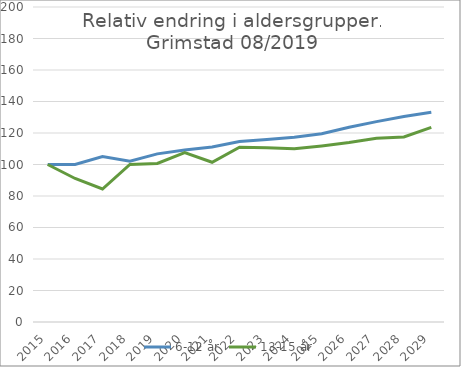
| Category | 6-12 år | 13-15 år |
|---|---|---|
| 2015.0 | 100 | 100 |
| 2016.0 | 100 | 91.111 |
| 2017.0 | 105.051 | 84.444 |
| 2018.0 | 102.02 | 100 |
| 2019.0 | 106.753 | 100.701 |
| 2020.0 | 109.23 | 107.504 |
| 2021.0 | 111.169 | 101.424 |
| 2022.0 | 114.6 | 110.996 |
| 2023.0 | 115.939 | 110.668 |
| 2024.0 | 117.35 | 109.942 |
| 2025.0 | 119.553 | 111.809 |
| 2026.0 | 123.678 | 113.942 |
| 2027.0 | 127.226 | 116.719 |
| 2028.0 | 130.519 | 117.511 |
| 2029.0 | 133.107 | 123.524 |